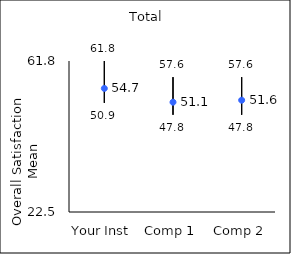
| Category | 25th percentile | 75th percentile | Mean |
|---|---|---|---|
| Your Inst | 50.9 | 61.8 | 54.67 |
| Comp 1 | 47.8 | 57.6 | 51.08 |
| Comp 2 | 47.8 | 57.6 | 51.6 |